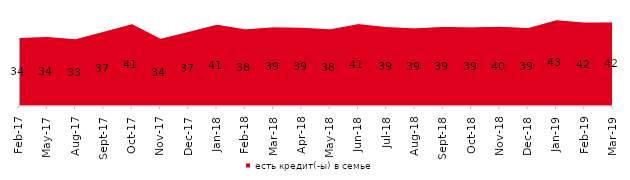
| Category | есть кредит(-ы) в семье |
|---|---|
| 2017-02-01 | 33.95 |
| 2017-05-01 | 34.4 |
| 2017-08-01 | 33.3 |
| 2017-09-01 | 37 |
| 2017-10-01 | 40.75 |
| 2017-11-01 | 33.5 |
| 2017-12-01 | 36.95 |
| 2018-01-01 | 40.5 |
| 2018-02-01 | 38.2 |
| 2018-03-01 | 39.2 |
| 2018-04-01 | 39 |
| 2018-05-01 | 38.2 |
| 2018-06-01 | 40.8 |
| 2018-07-01 | 39.3 |
| 2018-08-01 | 38.7 |
| 2018-09-01 | 39.4 |
| 2018-10-01 | 39.15 |
| 2018-11-01 | 39.521 |
| 2018-12-01 | 38.8 |
| 2019-01-01 | 42.7 |
| 2019-02-01 | 41.55 |
| 2019-03-01 | 41.621 |